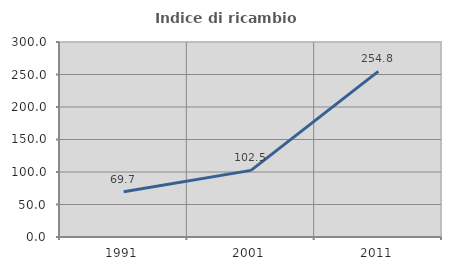
| Category | Indice di ricambio occupazionale  |
|---|---|
| 1991.0 | 69.671 |
| 2001.0 | 102.505 |
| 2011.0 | 254.79 |